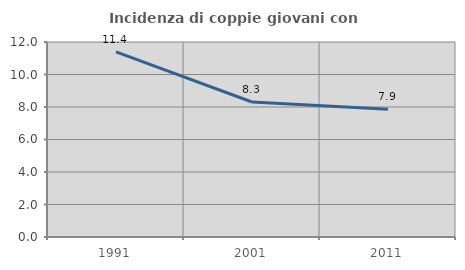
| Category | Incidenza di coppie giovani con figli |
|---|---|
| 1991.0 | 11.396 |
| 2001.0 | 8.307 |
| 2011.0 | 7.864 |